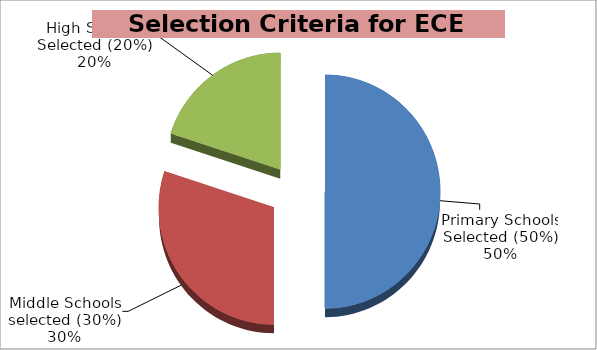
| Category | Series 0 |
|---|---|
| Primary Schools Selected (50%) | 2500 |
| Middle Schools selected (30%) | 1500 |
| High Schools Selected (20%) | 1000 |